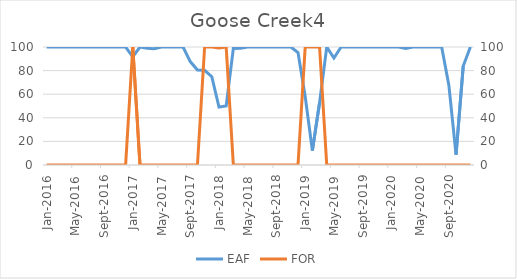
| Category | EAF |
|---|---|
| 2016-01-01 | 100 |
| 2016-02-01 | 100 |
| 2016-03-01 | 100 |
| 2016-04-01 | 100 |
| 2016-05-01 | 100 |
| 2016-06-01 | 100 |
| 2016-07-01 | 100 |
| 2016-08-01 | 100 |
| 2016-09-01 | 100 |
| 2016-10-01 | 100 |
| 2016-11-01 | 100 |
| 2016-12-01 | 100 |
| 2017-01-01 | 91.67 |
| 2017-02-01 | 100 |
| 2017-03-01 | 98.84 |
| 2017-04-01 | 98.48 |
| 2017-05-01 | 100 |
| 2017-06-01 | 100 |
| 2017-07-01 | 100 |
| 2017-08-01 | 100 |
| 2017-09-01 | 87.65 |
| 2017-10-01 | 80.58 |
| 2017-11-01 | 80.25 |
| 2017-12-01 | 74.8 |
| 2018-01-01 | 49.09 |
| 2018-02-01 | 50 |
| 2018-03-01 | 98.83 |
| 2018-04-01 | 98.86 |
| 2018-05-01 | 100 |
| 2018-06-01 | 100 |
| 2018-07-01 | 100 |
| 2018-08-01 | 100 |
| 2018-09-01 | 100 |
| 2018-10-01 | 100 |
| 2018-11-01 | 100 |
| 2018-12-01 | 95.27 |
| 2019-01-01 | 58.05 |
| 2019-02-01 | 12.2 |
| 2019-03-01 | 52.83 |
| 2019-04-01 | 100 |
| 2019-05-01 | 90.6 |
| 2019-06-01 | 100 |
| 2019-07-01 | 100 |
| 2019-08-01 | 100 |
| 2019-09-01 | 100 |
| 2019-10-01 | 100 |
| 2019-11-01 | 100 |
| 2019-12-01 | 100 |
| 2020-01-01 | 100 |
| 2020-02-01 | 100 |
| 2020-03-01 | 98.79 |
| 2020-04-01 | 100 |
| 2020-05-01 | 100 |
| 2020-06-01 | 100 |
| 2020-07-01 | 100 |
| 2020-08-01 | 100 |
| 2020-09-01 | 67.64 |
| 2020-10-01 | 8.77 |
| 2020-11-01 | 83.88 |
| 2020-12-01 | 100 |